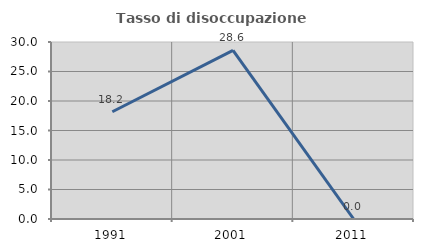
| Category | Tasso di disoccupazione giovanile  |
|---|---|
| 1991.0 | 18.182 |
| 2001.0 | 28.571 |
| 2011.0 | 0 |